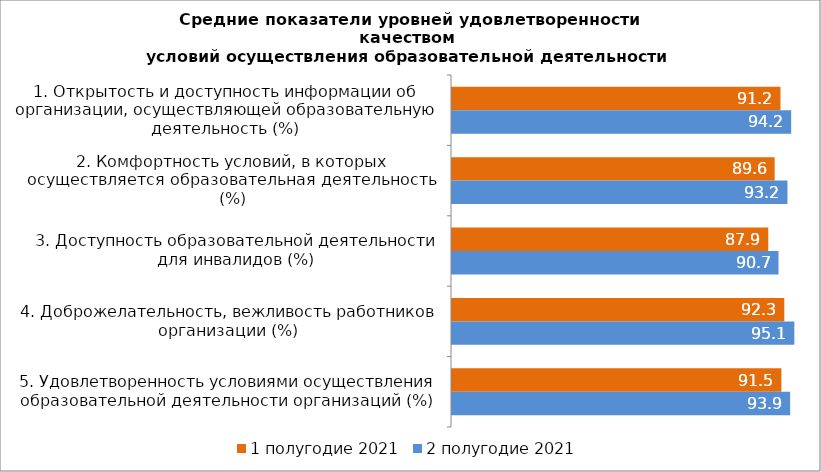
| Category | 1 полугодие 2021 | 2 полугодие 2021 |
|---|---|---|
| 1. Открытость и доступность информации об организации, осуществляющей образовательную деятельность (%) | 91.239 | 94.215 |
| 2. Комфортность условий, в которых осуществляется образовательная деятельность (%) | 89.632 | 93.178 |
| 3. Доступность образовательной деятельности для инвалидов (%) | 87.855 | 90.698 |
| 4. Доброжелательность, вежливость работников организации (%) | 92.31 | 95.094 |
| 5. Удовлетворенность условиями осуществления образовательной деятельности организаций (%) | 91.492 | 93.928 |